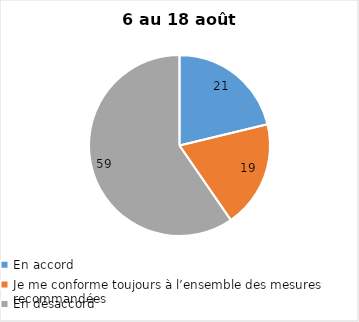
| Category | Series 0 |
|---|---|
| En accord | 21 |
| Je me conforme toujours à l’ensemble des mesures recommandées | 19 |
| En désaccord | 59 |